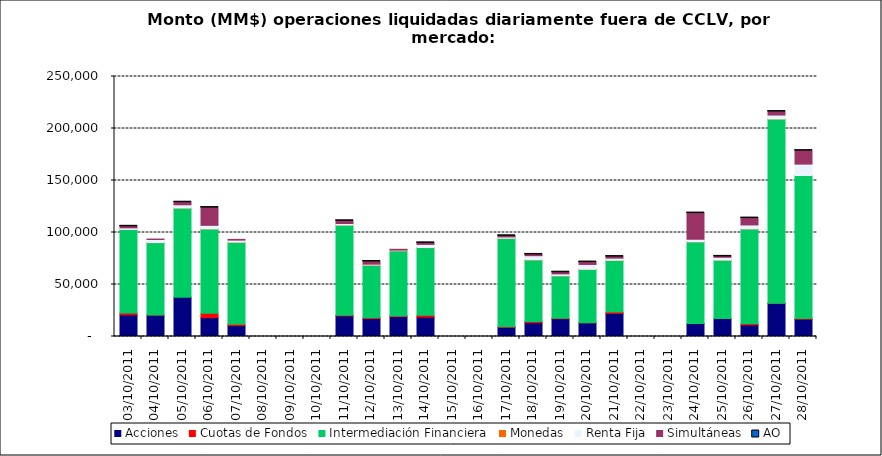
| Category | Acciones | Cuotas de Fondos | Intermediación Financiera | Monedas | Renta Fija | Simultáneas | AO |
|---|---|---|---|---|---|---|---|
| 03/10/2011 | 20863.169 | 1677.698 | 80342.052 | 27.62 | 1559.36 | 1467.92 | 0.026 |
| 04/10/2011 | 20515.112 | 45.038 | 69696.861 | 69.409 | 2934.597 | 430.797 | 0 |
| 05/10/2011 | 37787.006 | 0 | 85750.583 | 13.4 | 3107.283 | 2458.206 | 0.064 |
| 06/10/2011 | 18116.632 | 4218.089 | 81093.864 | 38.504 | 3400.808 | 17062.872 | 0.047 |
| 07/10/2011 | 10413.432 | 1325.421 | 78935.546 | 31.603 | 1960.136 | 701.377 | 0 |
| 11/10/2011 | 19825.97 | 582.147 | 86724.266 | 12.522 | 1485.799 | 2606.252 | 0.361 |
| 12/10/2011 | 17211.09 | 717.012 | 50724.973 | 37.575 | 845.279 | 2570.727 | 0.007 |
| 13/10/2011 | 19048.66 | 760.672 | 62614.361 | 17.18 | 607.742 | 813.867 | 0 |
| 14/10/2011 | 18613.523 | 1736.953 | 65139.348 | 53.886 | 2995.245 | 1459.139 | 0.073 |
| 17/10/2011 | 8730.365 | 563.155 | 85177.658 | 13.322 | 1224.553 | 1088.606 | 0.055 |
| 18/10/2011 | 13364.371 | 1024.018 | 59353.734 | 26.45 | 3935.377 | 1212.164 | 0.1 |
| 19/10/2011 | 17038.241 | 518.272 | 40835.366 | 18.655 | 1795.57 | 1617.332 | 0.046 |
| 20/10/2011 | 13114.298 | 220.314 | 51217.247 | 56.441 | 4668.011 | 2283.227 | 0.037 |
| 21/10/2011 | 22178.538 | 1294.291 | 49797.271 | 16.19 | 2020.398 | 1500.758 | 0.194 |
| 24/10/2011 | 12367.912 | 22.26 | 78686.077 | 6.745 | 2416.617 | 25166.965 | 0.006 |
| 25/10/2011 | 17352.218 | 22.184 | 56069.755 | 28.9 | 2710.854 | 834.922 | 0.085 |
| 26/10/2011 | 11074.508 | 1139.433 | 91268.37 | 14.66 | 3770.396 | 6584.678 | 0.08 |
| 27/10/2011 | 31850.605 | 131.713 | 177203.092 | 2.662 | 3745.707 | 3337.122 | 0.526 |
| 28/10/2011 | 16574.507 | 763.067 | 137419.95 | 64.316 | 10930.665 | 12938.448 | 0.718 |